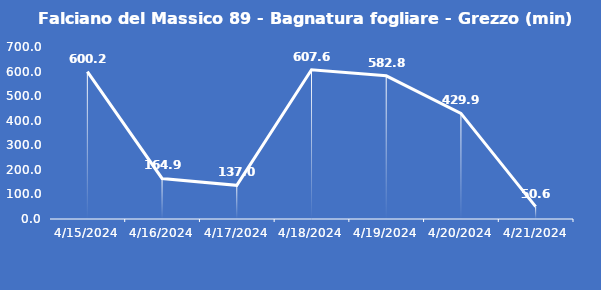
| Category | Falciano del Massico 89 - Bagnatura fogliare - Grezzo (min) |
|---|---|
| 4/15/24 | 600.2 |
| 4/16/24 | 164.9 |
| 4/17/24 | 137 |
| 4/18/24 | 607.6 |
| 4/19/24 | 582.8 |
| 4/20/24 | 429.9 |
| 4/21/24 | 50.6 |